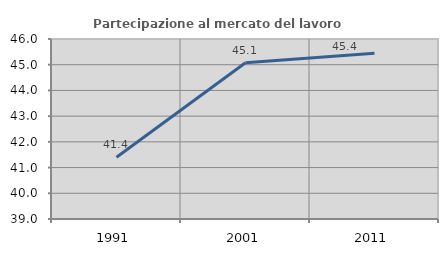
| Category | Partecipazione al mercato del lavoro  femminile |
|---|---|
| 1991.0 | 41.405 |
| 2001.0 | 45.073 |
| 2011.0 | 45.449 |